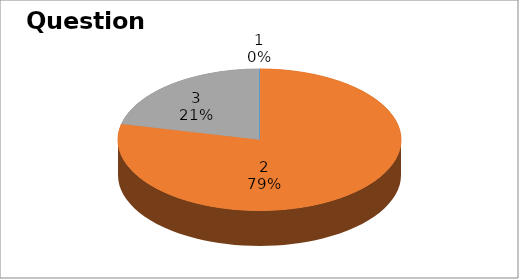
| Category | Series 0 |
|---|---|
| 0 | 0 |
| 1 | 11 |
| 2 | 3 |